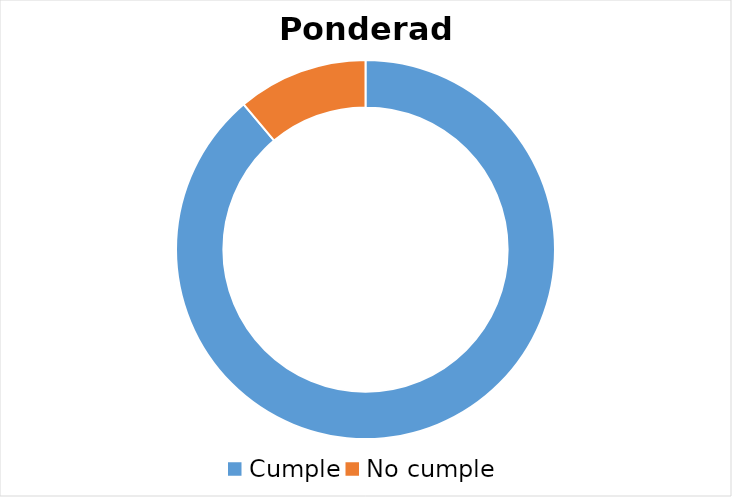
| Category | Ponderado |
|---|---|
| Cumple | 0.889 |
| No cumple | 0.111 |